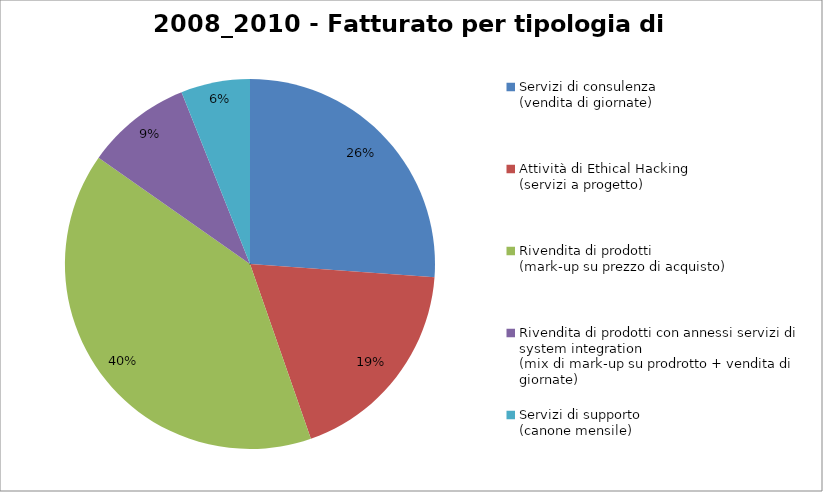
| Category | Tipologia di Servizi |
|---|---|
| Servizi di consulenza
(vendita di giornate) | 0.262 |
| Attività di Ethical Hacking
(servizi a progetto) | 0.185 |
| Rivendita di prodotti 
(mark-up su prezzo di acquisto) | 0.401 |
| Rivendita di prodotti con annessi servizi di system integration
(mix di mark-up su prodrotto + vendita di giornate) | 0.092 |
| Servizi di supporto
(canone mensile) | 0.06 |